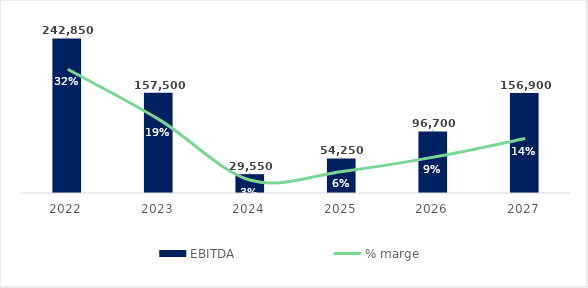
| Category | EBITDA |
|---|---|
| 2022 | 242850 |
| 2023 | 157500 |
| 2024 | 29550 |
| 2025 | 54250 |
| 2026 | 96700 |
| 2027 | 156900 |